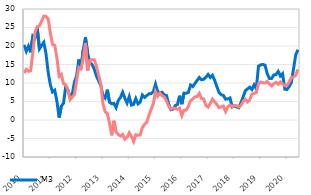
| Category | M3  | Domestic loans to the non-monetary sector |
|---|---|---|
| 2010-01-01 | 20.321 | 12.716 |
| 2010-02-01 | 18.563 | 13.658 |
| 2010-03-01 | 19.958 | 13.148 |
| 2010-04-01 | 18.299 | 13.298 |
| 2010-05-01 | 22.704 | 18.254 |
| 2010-06-01 | 22.117 | 23.797 |
| 2010-07-01 | 24.945 | 25.198 |
| 2010-08-01 | 19.219 | 25.416 |
| 2010-09-01 | 20.121 | 26.706 |
| 2010-10-01 | 20.973 | 28.071 |
| 2010-11-01 | 17.912 | 28.011 |
| 2010-12-01 | 12.874 | 27.273 |
| 2011-01-01 | 9.481 | 23.431 |
| 2011-02-01 | 7.576 | 20.396 |
| 2011-03-01 | 8.038 | 20.178 |
| 2011-04-01 | 4.954 | 16.733 |
| 2011-05-01 | 0.664 | 11.803 |
| 2011-06-01 | 3.749 | 12.354 |
| 2011-07-01 | 4.529 | 9.802 |
| 2011-08-01 | 9.076 | 9.549 |
| 2011-09-01 | 8.13 | 8.192 |
| 2011-10-01 | 6.156 | 5.467 |
| 2011-11-01 | 7.029 | 6.196 |
| 2011-12-01 | 10.264 | 6.941 |
| 2012-01-01 | 12.01 | 10.729 |
| 2012-02-01 | 16.354 | 14.221 |
| 2012-03-01 | 13.992 | 13.782 |
| 2012-04-01 | 18.952 | 16.69 |
| 2012-05-01 | 22.329 | 20.823 |
| 2012-06-01 | 18.134 | 13.296 |
| 2012-07-01 | 15.507 | 16.043 |
| 2012-08-01 | 15.015 | 16.313 |
| 2012-09-01 | 13.837 | 16.292 |
| 2012-10-01 | 11.912 | 14.641 |
| 2012-11-01 | 10.629 | 12.241 |
| 2012-12-01 | 9.421 | 9.834 |
| 2013-01-01 | 6.554 | 4.448 |
| 2013-02-01 | 5.916 | 2.211 |
| 2013-03-01 | 8.196 | 1.791 |
| 2013-04-01 | 4.809 | -0.816 |
| 2013-05-01 | 4.39 | -4.149 |
| 2013-06-01 | 4.482 | -0.203 |
| 2013-07-01 | 3.358 | -3.232 |
| 2013-08-01 | 5.277 | -3.913 |
| 2013-09-01 | 6.108 | -4.338 |
| 2013-10-01 | 7.502 | -3.897 |
| 2013-11-01 | 5.896 | -5.181 |
| 2013-12-01 | 4.573 | -4.65 |
| 2014-01-01 | 6.313 | -3.453 |
| 2014-02-01 | 4.038 | -4.43 |
| 2014-03-01 | 4.234 | -5.804 |
| 2014-04-01 | 5.797 | -3.993 |
| 2014-05-01 | 4.358 | -4.149 |
| 2014-06-01 | 4.845 | -4.035 |
| 2014-07-01 | 6.767 | -2.016 |
| 2014-08-01 | 6.108 | -1.198 |
| 2014-09-01 | 6.605 | -0.64 |
| 2014-10-01 | 7.075 | 1.254 |
| 2014-11-01 | 7.143 | 2.874 |
| 2014-12-01 | 7.648 | 4.423 |
| 2015-01-01 | 9.694 | 7.684 |
| 2015-02-01 | 7.639 | 6.418 |
| 2015-03-01 | 7.404 | 7.278 |
| 2015-04-01 | 7.508 | 6.557 |
| 2015-05-01 | 6.749 | 6.196 |
| 2015-06-01 | 6.629 | 5.14 |
| 2015-07-01 | 4.381 | 3.777 |
| 2015-08-01 | 2.769 | 2.955 |
| 2015-09-01 | 2.936 | 3.226 |
| 2015-10-01 | 3.902 | 3.199 |
| 2015-11-01 | 4.175 | 2.893 |
| 2015-12-01 | 6.564 | 3.196 |
| 2016-01-01 | 4.278 | 1.199 |
| 2016-02-01 | 7.267 | 2.638 |
| 2016-03-01 | 7.218 | 2.687 |
| 2016-04-01 | 7.458 | 3.711 |
| 2016-05-01 | 9.45 | 5.171 |
| 2016-06-01 | 9.03 | 5.69 |
| 2016-07-01 | 9.881 | 6.257 |
| 2016-08-01 | 10.715 | 6.355 |
| 2016-09-01 | 11.496 | 7.196 |
| 2016-10-01 | 10.853 | 5.785 |
| 2016-11-01 | 11.002 | 5.691 |
| 2016-12-01 | 11.553 | 3.906 |
| 2017-01-01 | 12.319 | 3.474 |
| 2017-02-01 | 11.489 | 4.47 |
| 2017-03-01 | 12.067 | 5.654 |
| 2017-04-01 | 10.696 | 4.923 |
| 2017-05-01 | 9.013 | 4.221 |
| 2017-06-01 | 7.423 | 3.312 |
| 2017-07-01 | 6.807 | 3.565 |
| 2017-08-01 | 6.642 | 3.755 |
| 2017-09-01 | 5.632 | 2.278 |
| 2017-10-01 | 5.691 | 3.574 |
| 2017-11-01 | 5.952 | 4.092 |
| 2017-12-01 | 3.567 | 3.671 |
| 2018-01-01 | 3.888 | 3.977 |
| 2018-02-01 | 3.511 | 3.859 |
| 2018-03-01 | 3.318 | 3.502 |
| 2018-04-01 | 4.689 | 3.953 |
| 2018-05-01 | 6.249 | 5.016 |
| 2018-06-01 | 7.929 | 5.586 |
| 2018-07-01 | 8.383 | 4.847 |
| 2018-08-01 | 8.861 | 5.412 |
| 2018-09-01 | 8.24 | 7.016 |
| 2018-10-31 | 9.483 | 7.163 |
| 2018-11-30 | 8.409 | 7.417 |
| 2018-12-31 | 14.522 | 9.795 |
| 2019-01-31 | 14.909 | 10.252 |
| 2019-02-28 | 15.018 | 10.086 |
| 2019-03-31 | 14.797 | 9.982 |
| 2019-04-30 | 12.506 | 10.444 |
| 2019-05-31 | 11.216 | 9.694 |
| 2019-06-30 | 11.23 | 9.224 |
| 2019-07-31 | 12.186 | 9.826 |
| 2019-08-31 | 12.279 | 10.177 |
| 2019-09-30 | 13.127 | 9.697 |
| 2019-10-31 | 11.864 | 10.311 |
| 2019-11-30 | 12.513 | 9.755 |
| 2019-12-31 | 8.354 | 9.245 |
| 2020-01-31 | 8.237 | 9.334 |
| 2020-02-29 | 9.035 | 10.229 |
| 2020-03-31 | 10.113 | 11.424 |
| 2020-04-30 | 13.811 | 11.641 |
| 2020-05-31 | 17.557 | 12.071 |
| 2020-06-30 | 18.995 | 13.679 |